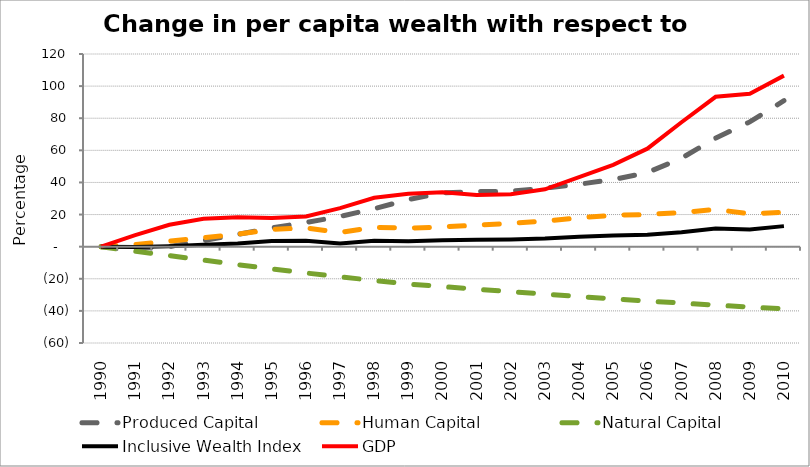
| Category | Produced Capital  | Human Capital | Natural Capital | Inclusive Wealth Index | GDP |
|---|---|---|---|---|---|
| 1990.0 | 0 | 0 | 0 | 0 | 0 |
| 1991.0 | -0.946 | 1.303 | -2.833 | -0.245 | 7.194 |
| 1992.0 | 0.117 | 3.466 | -5.533 | 0.308 | 13.623 |
| 1993.0 | 3.78 | 5.643 | -8.325 | 1.194 | 17.382 |
| 1994.0 | 7.569 | 7.737 | -11.186 | 2.03 | 18.278 |
| 1995.0 | 11.691 | 10.712 | -13.842 | 3.469 | 17.921 |
| 1996.0 | 15.087 | 11.708 | -16.388 | 3.727 | 18.807 |
| 1997.0 | 18.819 | 8.857 | -18.779 | 1.908 | 23.966 |
| 1998.0 | 23.665 | 12.083 | -21.082 | 3.693 | 30.446 |
| 1999.0 | 29.319 | 11.48 | -23.314 | 3.451 | 32.912 |
| 2000.0 | 33.506 | 12.269 | -24.889 | 3.992 | 33.921 |
| 2001.0 | 34.316 | 13.374 | -26.437 | 4.26 | 32.16 |
| 2002.0 | 34.495 | 14.547 | -28.037 | 4.464 | 32.619 |
| 2003.0 | 36.376 | 15.943 | -29.579 | 5.044 | 35.701 |
| 2004.0 | 38.908 | 18.034 | -31.065 | 6.121 | 43.322 |
| 2005.0 | 41.811 | 19.569 | -32.498 | 6.95 | 50.956 |
| 2006.0 | 46.17 | 20.013 | -33.902 | 7.37 | 61.031 |
| 2007.0 | 55.102 | 21.264 | -35.153 | 8.913 | 77.514 |
| 2008.0 | 67.566 | 23.211 | -36.436 | 11.318 | 93.341 |
| 2009.0 | 77.713 | 20.418 | -37.632 | 10.763 | 95.24 |
| 2010.0 | 90.955 | 21.453 | -38.781 | 12.799 | 106.533 |